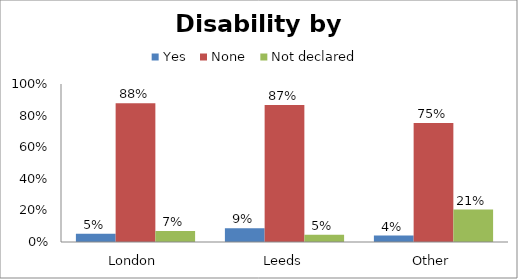
| Category | Yes | None | Not declared |
|---|---|---|---|
| London | 0.052 | 0.878 | 0.07 |
| Leeds | 0.087 | 0.867 | 0.045 |
| Other | 0.041 | 0.753 | 0.205 |